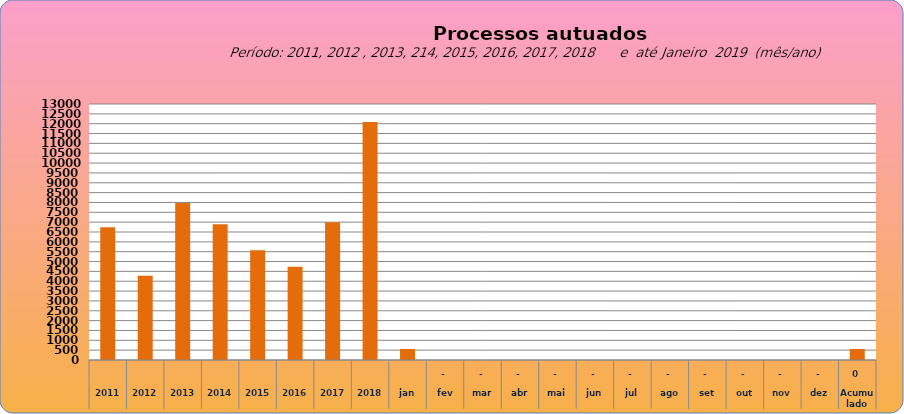
| Category | 6735 |
|---|---|
| 2011 | 6735 |
| 2012 | 4276 |
| 2013 | 7967 |
| 2014 | 6893 |
| 2015 | 5569 |
| 2016 | 4737 |
| 2017 | 6997 |
| 2018 | 12080 |
| jan | 560 |
| fev | 0 |
| mar | 0 |
| abr | 0 |
| mai | 0 |
| jun | 0 |
| jul | 0 |
| ago | 0 |
| set | 0 |
| out | 0 |
| nov | 0 |
| dez | 0 |
| Acumulado
 | 560 |